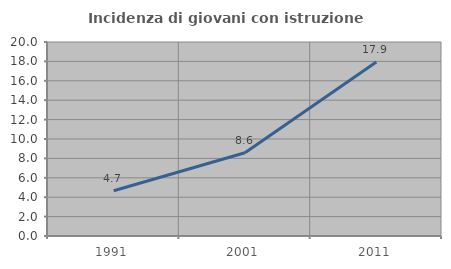
| Category | Incidenza di giovani con istruzione universitaria |
|---|---|
| 1991.0 | 4.663 |
| 2001.0 | 8.586 |
| 2011.0 | 17.949 |